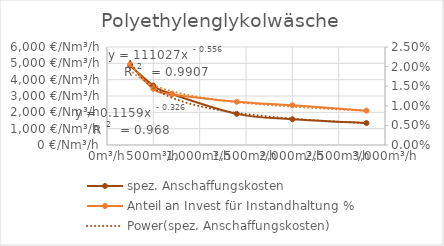
| Category | spez. Anschaffungskosten |
|---|---|
| 250.0 | 4851.772 |
| 500.0 | 3638.828 |
| 700.0 | 3118.996 |
| 1400.0 | 1906.053 |
| 2000.0 | 1576.826 |
| 2800.0 | 1342.901 |